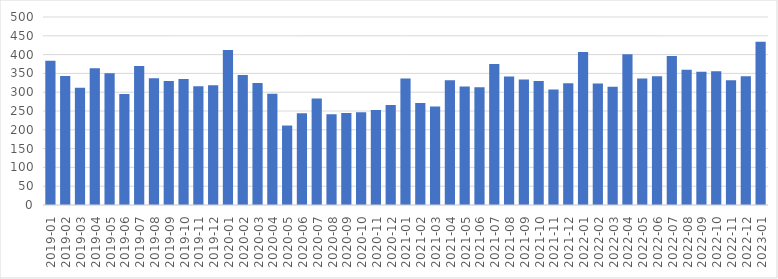
| Category | Series 0 |
|---|---|
| 2019-01 | 383.506 |
| 2019-02 | 342.885 |
| 2019-03 | 311.697 |
| 2019-04 | 363.936 |
| 2019-05 | 350.511 |
| 2019-06 | 295.086 |
| 2019-07 | 369.906 |
| 2019-08 | 336.855 |
| 2019-09 | 330.025 |
| 2019-10 | 334.947 |
| 2019-11 | 315.813 |
| 2019-12 | 318.477 |
| 2020-01 | 411.97 |
| 2020-02 | 345.446 |
| 2020-03 | 324.145 |
| 2020-04 | 295.553 |
| 2020-05 | 211.364 |
| 2020-06 | 243.993 |
| 2020-07 | 283.161 |
| 2020-08 | 241.463 |
| 2020-09 | 244.655 |
| 2020-10 | 246.638 |
| 2020-11 | 252.827 |
| 2020-12 | 266.234 |
| 2021-01 | 336.508 |
| 2021-02 | 271.175 |
| 2021-03 | 262.244 |
| 2021-04 | 331.57 |
| 2021-05 | 315.196 |
| 2021-06 | 313.13 |
| 2021-07 | 374.842 |
| 2021-08 | 341.908 |
| 2021-09 | 334.085 |
| 2021-10 | 329.634 |
| 2021-11 | 307.076 |
| 2021-12 | 323.802 |
| 2022-01 | 406.968 |
| 2022-02 | 323.043 |
| 2022-03 | 314.264 |
| 2022-04 | 400.831 |
| 2022-05 | 336.705 |
| 2022-06 | 342.285 |
| 2022-07 | 395.993 |
| 2022-08 | 359.775 |
| 2022-09 | 354.547 |
| 2022-10 | 356.043 |
| 2022-11 | 331.745 |
| 2022-12 | 342.151 |
| 2023-01 | 434.39 |